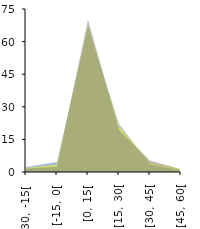
| Category | nov.2021 | dic.2021 | ene.2022 |
|---|---|---|---|
| [-30, -15[ | 2.326 | 1.97 | 1.613 |
| [-15, 0[ | 4.651 | 3.448 | 2.419 |
| [0, 15[ | 66.86 | 67.488 | 70.161 |
| [15, 30[ | 22.093 | 21.182 | 19.355 |
| [30, 45[ | 3.488 | 4.433 | 5.242 |
| [45, 60[ | 0.581 | 1.478 | 1.21 |